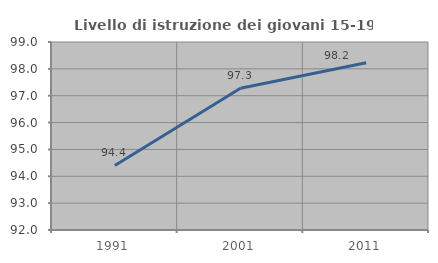
| Category | Livello di istruzione dei giovani 15-19 anni |
|---|---|
| 1991.0 | 94.402 |
| 2001.0 | 97.276 |
| 2011.0 | 98.229 |